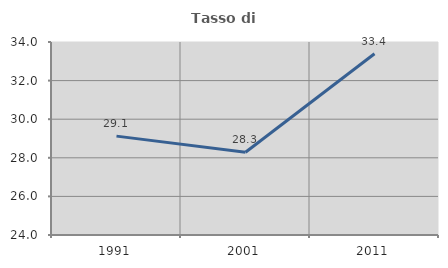
| Category | Tasso di occupazione   |
|---|---|
| 1991.0 | 29.123 |
| 2001.0 | 28.29 |
| 2011.0 | 33.389 |